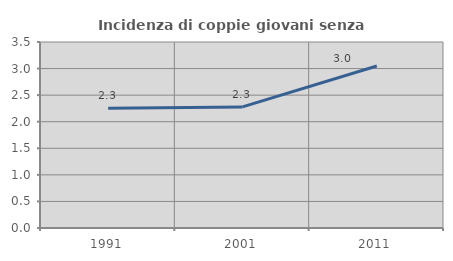
| Category | Incidenza di coppie giovani senza figli |
|---|---|
| 1991.0 | 2.252 |
| 2001.0 | 2.278 |
| 2011.0 | 3.049 |